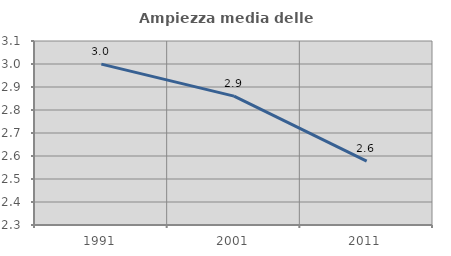
| Category | Ampiezza media delle famiglie |
|---|---|
| 1991.0 | 2.999 |
| 2001.0 | 2.86 |
| 2011.0 | 2.578 |